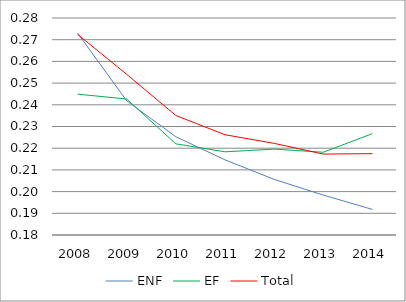
| Category | ENF | EF | Total |
|---|---|---|---|
| 2008.0 | 0.273 | 0.245 | 0.272 |
| 2009.0 | 0.242 | 0.243 | 0.254 |
| 2010.0 | 0.225 | 0.222 | 0.235 |
| 2011.0 | 0.215 | 0.218 | 0.226 |
| 2012.0 | 0.206 | 0.22 | 0.222 |
| 2013.0 | 0.198 | 0.218 | 0.217 |
| 2014.0 | 0.192 | 0.227 | 0.217 |